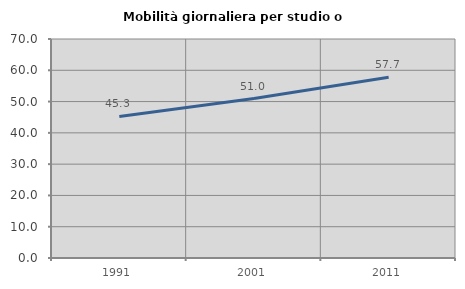
| Category | Mobilità giornaliera per studio o lavoro |
|---|---|
| 1991.0 | 45.259 |
| 2001.0 | 50.969 |
| 2011.0 | 57.748 |